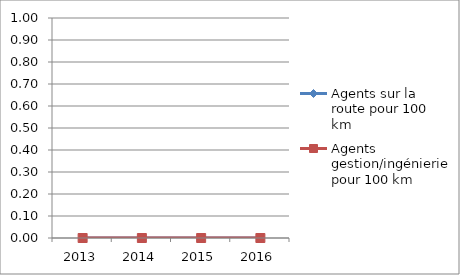
| Category | Agents sur la route pour 100 km | Agents  gestion/ingénierie pour 100 km |
|---|---|---|
| 2013.0 | 0 | 0 |
| 2014.0 | 0 | 0 |
| 2015.0 | 0 | 0 |
| 2016.0 | 0 | 0 |